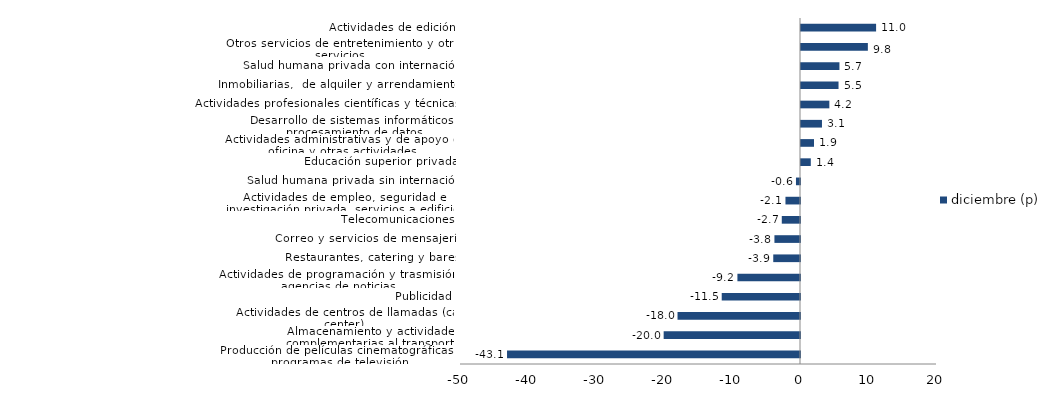
| Category | diciembre (p) |
|---|---|
| Producción de películas cinematográficas y programas de televisión | -43.084 |
| Almacenamiento y actividades complementarias al transporte | -20.049 |
| Actividades de centros de llamadas (call center) | -18.011 |
| Publicidad | -11.512 |
| Actividades de programación y trasmisión,  agencias de noticias | -9.203 |
| Restaurantes, catering y bares | -3.934 |
| Correo y servicios de mensajería | -3.76 |
| Telecomunicaciones | -2.679 |
| Actividades de empleo, seguridad e investigación privada, servicios a edificios | -2.138 |
| Salud humana privada sin internación | -0.593 |
| Educación superior privada | 1.442 |
| Actividades administrativas y de apoyo de oficina y otras actividades | 1.916 |
| Desarrollo de sistemas informáticos y procesamiento de datos | 3.084 |
| Actividades profesionales científicas y técnicas  | 4.168 |
| Inmobiliarias,  de alquiler y arrendamiento  | 5.519 |
| Salud humana privada con internación | 5.653 |
| Otros servicios de entretenimiento y otros servicios | 9.832 |
| Actividades de edición | 11.044 |